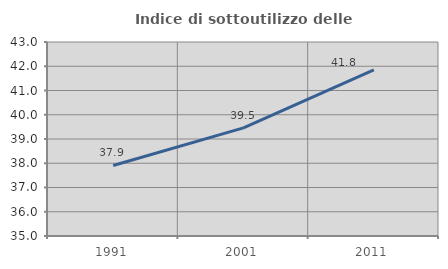
| Category | Indice di sottoutilizzo delle abitazioni  |
|---|---|
| 1991.0 | 37.908 |
| 2001.0 | 39.459 |
| 2011.0 | 41.848 |